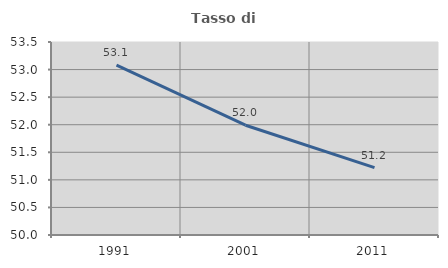
| Category | Tasso di occupazione   |
|---|---|
| 1991.0 | 53.081 |
| 2001.0 | 51.991 |
| 2011.0 | 51.221 |